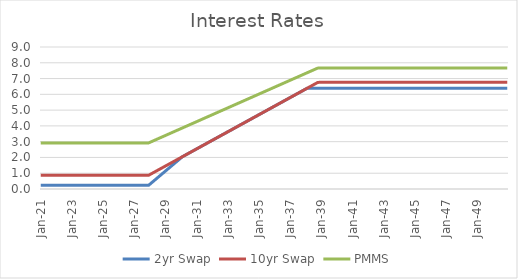
| Category | 2yr Swap | 10yr Swap | PMMS |
|---|---|---|---|
| 2021-01-31 | 0.232 | 0.869 | 2.919 |
| 2021-02-28 | 0.232 | 0.869 | 2.919 |
| 2021-03-31 | 0.232 | 0.869 | 2.919 |
| 2021-04-30 | 0.232 | 0.869 | 2.919 |
| 2021-05-31 | 0.232 | 0.869 | 2.919 |
| 2021-06-30 | 0.232 | 0.869 | 2.919 |
| 2021-07-31 | 0.232 | 0.869 | 2.919 |
| 2021-08-31 | 0.232 | 0.869 | 2.919 |
| 2021-09-30 | 0.232 | 0.869 | 2.919 |
| 2021-10-31 | 0.232 | 0.869 | 2.919 |
| 2021-11-30 | 0.232 | 0.869 | 2.919 |
| 2021-12-31 | 0.232 | 0.869 | 2.919 |
| 2022-01-31 | 0.232 | 0.869 | 2.919 |
| 2022-02-28 | 0.232 | 0.869 | 2.919 |
| 2022-03-31 | 0.232 | 0.869 | 2.919 |
| 2022-04-30 | 0.232 | 0.869 | 2.919 |
| 2022-05-31 | 0.232 | 0.869 | 2.919 |
| 2022-06-30 | 0.232 | 0.869 | 2.919 |
| 2022-07-31 | 0.232 | 0.869 | 2.919 |
| 2022-08-31 | 0.232 | 0.869 | 2.919 |
| 2022-09-30 | 0.232 | 0.869 | 2.919 |
| 2022-10-31 | 0.232 | 0.869 | 2.919 |
| 2022-11-30 | 0.232 | 0.869 | 2.919 |
| 2022-12-31 | 0.232 | 0.869 | 2.919 |
| 2023-01-31 | 0.232 | 0.869 | 2.919 |
| 2023-02-28 | 0.232 | 0.869 | 2.919 |
| 2023-03-31 | 0.232 | 0.869 | 2.919 |
| 2023-04-30 | 0.232 | 0.869 | 2.919 |
| 2023-05-31 | 0.232 | 0.869 | 2.919 |
| 2023-06-30 | 0.232 | 0.869 | 2.919 |
| 2023-07-31 | 0.232 | 0.869 | 2.919 |
| 2023-08-31 | 0.232 | 0.869 | 2.919 |
| 2023-09-30 | 0.232 | 0.869 | 2.919 |
| 2023-10-31 | 0.232 | 0.869 | 2.919 |
| 2023-11-30 | 0.232 | 0.869 | 2.919 |
| 2023-12-31 | 0.232 | 0.869 | 2.919 |
| 2024-01-31 | 0.232 | 0.869 | 2.919 |
| 2024-02-29 | 0.232 | 0.869 | 2.919 |
| 2024-03-31 | 0.232 | 0.869 | 2.919 |
| 2024-04-30 | 0.232 | 0.869 | 2.919 |
| 2024-05-31 | 0.232 | 0.869 | 2.919 |
| 2024-06-30 | 0.232 | 0.869 | 2.919 |
| 2024-07-31 | 0.232 | 0.869 | 2.919 |
| 2024-08-31 | 0.232 | 0.869 | 2.919 |
| 2024-09-30 | 0.232 | 0.869 | 2.919 |
| 2024-10-31 | 0.232 | 0.869 | 2.919 |
| 2024-11-30 | 0.232 | 0.869 | 2.919 |
| 2024-12-31 | 0.232 | 0.869 | 2.919 |
| 2025-01-31 | 0.232 | 0.869 | 2.919 |
| 2025-02-28 | 0.232 | 0.869 | 2.919 |
| 2025-03-31 | 0.232 | 0.869 | 2.919 |
| 2025-04-30 | 0.232 | 0.869 | 2.919 |
| 2025-05-31 | 0.232 | 0.869 | 2.919 |
| 2025-06-30 | 0.232 | 0.869 | 2.919 |
| 2025-07-31 | 0.232 | 0.869 | 2.919 |
| 2025-08-31 | 0.232 | 0.869 | 2.919 |
| 2025-09-30 | 0.232 | 0.869 | 2.919 |
| 2025-10-31 | 0.232 | 0.869 | 2.919 |
| 2025-11-30 | 0.232 | 0.869 | 2.919 |
| 2025-12-31 | 0.232 | 0.869 | 2.919 |
| 2026-01-31 | 0.232 | 0.869 | 2.919 |
| 2026-02-28 | 0.232 | 0.869 | 2.919 |
| 2026-03-31 | 0.232 | 0.869 | 2.919 |
| 2026-04-30 | 0.232 | 0.869 | 2.919 |
| 2026-05-31 | 0.232 | 0.869 | 2.919 |
| 2026-06-30 | 0.232 | 0.869 | 2.919 |
| 2026-07-31 | 0.232 | 0.869 | 2.919 |
| 2026-08-31 | 0.232 | 0.869 | 2.919 |
| 2026-09-30 | 0.232 | 0.869 | 2.919 |
| 2026-10-31 | 0.232 | 0.869 | 2.919 |
| 2026-11-30 | 0.232 | 0.869 | 2.919 |
| 2026-12-31 | 0.232 | 0.869 | 2.919 |
| 2027-01-31 | 0.232 | 0.869 | 2.919 |
| 2027-02-28 | 0.232 | 0.869 | 2.919 |
| 2027-03-31 | 0.232 | 0.869 | 2.919 |
| 2027-04-30 | 0.232 | 0.869 | 2.919 |
| 2027-05-31 | 0.232 | 0.869 | 2.919 |
| 2027-06-30 | 0.232 | 0.869 | 2.919 |
| 2027-07-31 | 0.232 | 0.869 | 2.919 |
| 2027-08-31 | 0.232 | 0.869 | 2.919 |
| 2027-09-30 | 0.232 | 0.869 | 2.919 |
| 2027-10-31 | 0.232 | 0.869 | 2.919 |
| 2027-11-30 | 0.232 | 0.869 | 2.919 |
| 2027-12-31 | 0.232 | 0.869 | 2.919 |
| 2028-01-31 | 0.301 | 0.914 | 2.956 |
| 2028-02-29 | 0.371 | 0.959 | 2.992 |
| 2028-03-31 | 0.441 | 1.004 | 3.028 |
| 2028-04-30 | 0.51 | 1.05 | 3.065 |
| 2028-05-31 | 0.58 | 1.095 | 3.101 |
| 2028-06-30 | 0.65 | 1.14 | 3.138 |
| 2028-07-31 | 0.719 | 1.185 | 3.174 |
| 2028-08-31 | 0.789 | 1.23 | 3.211 |
| 2028-09-30 | 0.859 | 1.276 | 3.247 |
| 2028-10-31 | 0.928 | 1.321 | 3.284 |
| 2028-11-30 | 0.998 | 1.366 | 3.32 |
| 2028-12-31 | 1.068 | 1.411 | 3.357 |
| 2029-01-31 | 1.137 | 1.457 | 3.393 |
| 2029-02-28 | 1.207 | 1.502 | 3.43 |
| 2029-03-31 | 1.277 | 1.547 | 3.466 |
| 2029-04-30 | 1.346 | 1.592 | 3.503 |
| 2029-05-31 | 1.416 | 1.637 | 3.539 |
| 2029-06-30 | 1.486 | 1.683 | 3.576 |
| 2029-07-31 | 1.555 | 1.728 | 3.612 |
| 2029-08-31 | 1.625 | 1.773 | 3.649 |
| 2029-09-30 | 1.695 | 1.818 | 3.685 |
| 2029-10-31 | 1.764 | 1.864 | 3.722 |
| 2029-11-30 | 1.834 | 1.909 | 3.758 |
| 2029-12-31 | 1.904 | 1.954 | 3.795 |
| 2030-01-31 | 1.973 | 1.999 | 3.831 |
| 2030-02-28 | 2.043 | 2.044 | 3.868 |
| 2030-03-31 | 2.09 | 2.09 | 3.904 |
| 2030-04-30 | 2.135 | 2.135 | 3.94 |
| 2030-05-31 | 2.18 | 2.18 | 3.977 |
| 2030-06-30 | 2.225 | 2.225 | 4.013 |
| 2030-07-31 | 2.27 | 2.27 | 4.05 |
| 2030-08-31 | 2.316 | 2.316 | 4.086 |
| 2030-09-30 | 2.361 | 2.361 | 4.123 |
| 2030-10-31 | 2.406 | 2.406 | 4.159 |
| 2030-11-30 | 2.451 | 2.451 | 4.196 |
| 2030-12-31 | 2.497 | 2.497 | 4.232 |
| 2031-01-31 | 2.542 | 2.542 | 4.269 |
| 2031-02-28 | 2.587 | 2.587 | 4.305 |
| 2031-03-31 | 2.632 | 2.632 | 4.342 |
| 2031-04-30 | 2.677 | 2.677 | 4.378 |
| 2031-05-31 | 2.723 | 2.723 | 4.414 |
| 2031-06-30 | 2.768 | 2.768 | 4.451 |
| 2031-07-31 | 2.813 | 2.813 | 4.487 |
| 2031-08-31 | 2.858 | 2.858 | 4.524 |
| 2031-09-30 | 2.904 | 2.904 | 4.56 |
| 2031-10-31 | 2.949 | 2.949 | 4.597 |
| 2031-11-30 | 2.994 | 2.994 | 4.633 |
| 2031-12-31 | 3.039 | 3.039 | 4.67 |
| 2032-01-31 | 3.084 | 3.084 | 4.706 |
| 2032-02-29 | 3.13 | 3.13 | 4.743 |
| 2032-03-31 | 3.175 | 3.175 | 4.779 |
| 2032-04-30 | 3.22 | 3.22 | 4.816 |
| 2032-05-31 | 3.265 | 3.265 | 4.852 |
| 2032-06-30 | 3.311 | 3.311 | 4.888 |
| 2032-07-31 | 3.356 | 3.356 | 4.925 |
| 2032-08-31 | 3.401 | 3.401 | 4.961 |
| 2032-09-30 | 3.446 | 3.446 | 4.998 |
| 2032-10-31 | 3.491 | 3.491 | 5.034 |
| 2032-11-30 | 3.537 | 3.537 | 5.071 |
| 2032-12-31 | 3.582 | 3.582 | 5.107 |
| 2033-01-31 | 3.627 | 3.627 | 5.144 |
| 2033-02-28 | 3.672 | 3.672 | 5.18 |
| 2033-03-31 | 3.718 | 3.718 | 5.217 |
| 2033-04-30 | 3.763 | 3.763 | 5.253 |
| 2033-05-31 | 3.808 | 3.808 | 5.29 |
| 2033-06-30 | 3.853 | 3.853 | 5.326 |
| 2033-07-31 | 3.898 | 3.898 | 5.362 |
| 2033-08-31 | 3.944 | 3.944 | 5.399 |
| 2033-09-30 | 3.989 | 3.989 | 5.435 |
| 2033-10-31 | 4.034 | 4.034 | 5.472 |
| 2033-11-30 | 4.079 | 4.079 | 5.508 |
| 2033-12-31 | 4.125 | 4.125 | 5.545 |
| 2034-01-31 | 4.17 | 4.17 | 5.581 |
| 2034-02-28 | 4.215 | 4.215 | 5.618 |
| 2034-03-31 | 4.26 | 4.26 | 5.654 |
| 2034-04-30 | 4.305 | 4.305 | 5.691 |
| 2034-05-31 | 4.351 | 4.351 | 5.727 |
| 2034-06-30 | 4.396 | 4.396 | 5.764 |
| 2034-07-31 | 4.441 | 4.441 | 5.8 |
| 2034-08-31 | 4.486 | 4.486 | 5.836 |
| 2034-09-30 | 4.532 | 4.532 | 5.873 |
| 2034-10-31 | 4.577 | 4.577 | 5.909 |
| 2034-11-30 | 4.622 | 4.622 | 5.946 |
| 2034-12-31 | 4.667 | 4.667 | 5.982 |
| 2035-01-31 | 4.712 | 4.712 | 6.019 |
| 2035-02-28 | 4.758 | 4.758 | 6.055 |
| 2035-03-31 | 4.803 | 4.803 | 6.092 |
| 2035-04-30 | 4.848 | 4.848 | 6.128 |
| 2035-05-31 | 4.893 | 4.893 | 6.165 |
| 2035-06-30 | 4.939 | 4.939 | 6.201 |
| 2035-07-31 | 4.984 | 4.984 | 6.238 |
| 2035-08-31 | 5.029 | 5.029 | 6.274 |
| 2035-09-30 | 5.074 | 5.074 | 6.31 |
| 2035-10-31 | 5.119 | 5.119 | 6.347 |
| 2035-11-30 | 5.165 | 5.165 | 6.383 |
| 2035-12-31 | 5.21 | 5.21 | 6.42 |
| 2036-01-31 | 5.255 | 5.255 | 6.456 |
| 2036-02-29 | 5.3 | 5.3 | 6.493 |
| 2036-03-31 | 5.345 | 5.345 | 6.529 |
| 2036-04-30 | 5.391 | 5.391 | 6.566 |
| 2036-05-31 | 5.436 | 5.436 | 6.602 |
| 2036-06-30 | 5.481 | 5.481 | 6.639 |
| 2036-07-31 | 5.526 | 5.526 | 6.675 |
| 2036-08-31 | 5.572 | 5.572 | 6.712 |
| 2036-09-30 | 5.617 | 5.617 | 6.748 |
| 2036-10-31 | 5.662 | 5.662 | 6.784 |
| 2036-11-30 | 5.707 | 5.707 | 6.821 |
| 2036-12-31 | 5.752 | 5.752 | 6.857 |
| 2037-01-31 | 5.798 | 5.798 | 6.894 |
| 2037-02-28 | 5.843 | 5.843 | 6.93 |
| 2037-03-31 | 5.888 | 5.888 | 6.967 |
| 2037-04-30 | 5.933 | 5.933 | 7.003 |
| 2037-05-31 | 5.979 | 5.979 | 7.04 |
| 2037-06-30 | 6.024 | 6.024 | 7.076 |
| 2037-07-31 | 6.069 | 6.069 | 7.113 |
| 2037-08-31 | 6.114 | 6.114 | 7.149 |
| 2037-09-30 | 6.159 | 6.159 | 7.186 |
| 2037-10-31 | 6.205 | 6.205 | 7.222 |
| 2037-11-30 | 6.25 | 6.25 | 7.258 |
| 2037-12-31 | 6.295 | 6.295 | 7.295 |
| 2038-01-31 | 6.34 | 6.34 | 7.331 |
| 2038-02-28 | 6.386 | 6.386 | 7.368 |
| 2038-03-31 | 6.387 | 6.431 | 7.404 |
| 2038-04-30 | 6.387 | 6.476 | 7.441 |
| 2038-05-31 | 6.387 | 6.521 | 7.477 |
| 2038-06-30 | 6.387 | 6.566 | 7.514 |
| 2038-07-31 | 6.387 | 6.612 | 7.55 |
| 2038-08-31 | 6.387 | 6.657 | 7.586 |
| 2038-09-30 | 6.387 | 6.702 | 7.623 |
| 2038-10-31 | 6.387 | 6.747 | 7.659 |
| 2038-11-30 | 6.387 | 6.758 | 7.668 |
| 2038-12-31 | 6.387 | 6.758 | 7.668 |
| 2039-01-31 | 6.387 | 6.758 | 7.668 |
| 2039-02-28 | 6.387 | 6.758 | 7.668 |
| 2039-03-31 | 6.387 | 6.758 | 7.668 |
| 2039-04-30 | 6.387 | 6.758 | 7.668 |
| 2039-05-31 | 6.387 | 6.758 | 7.668 |
| 2039-06-30 | 6.387 | 6.758 | 7.668 |
| 2039-07-31 | 6.387 | 6.758 | 7.668 |
| 2039-08-31 | 6.387 | 6.758 | 7.668 |
| 2039-09-30 | 6.387 | 6.758 | 7.668 |
| 2039-10-31 | 6.387 | 6.758 | 7.668 |
| 2039-11-30 | 6.387 | 6.758 | 7.668 |
| 2039-12-31 | 6.387 | 6.758 | 7.668 |
| 2040-01-31 | 6.387 | 6.758 | 7.668 |
| 2040-02-29 | 6.387 | 6.758 | 7.668 |
| 2040-03-31 | 6.387 | 6.758 | 7.668 |
| 2040-04-30 | 6.387 | 6.758 | 7.668 |
| 2040-05-31 | 6.387 | 6.758 | 7.668 |
| 2040-06-30 | 6.387 | 6.758 | 7.668 |
| 2040-07-31 | 6.387 | 6.758 | 7.668 |
| 2040-08-31 | 6.387 | 6.758 | 7.668 |
| 2040-09-30 | 6.387 | 6.758 | 7.668 |
| 2040-10-31 | 6.387 | 6.758 | 7.668 |
| 2040-11-30 | 6.387 | 6.758 | 7.668 |
| 2040-12-31 | 6.387 | 6.758 | 7.668 |
| 2041-01-31 | 6.387 | 6.758 | 7.668 |
| 2041-02-28 | 6.387 | 6.758 | 7.668 |
| 2041-03-31 | 6.387 | 6.758 | 7.668 |
| 2041-04-30 | 6.387 | 6.758 | 7.668 |
| 2041-05-31 | 6.387 | 6.758 | 7.668 |
| 2041-06-30 | 6.387 | 6.758 | 7.668 |
| 2041-07-31 | 6.387 | 6.758 | 7.668 |
| 2041-08-31 | 6.387 | 6.758 | 7.668 |
| 2041-09-30 | 6.387 | 6.758 | 7.668 |
| 2041-10-31 | 6.387 | 6.758 | 7.668 |
| 2041-11-30 | 6.387 | 6.758 | 7.668 |
| 2041-12-31 | 6.387 | 6.758 | 7.668 |
| 2042-01-31 | 6.387 | 6.758 | 7.668 |
| 2042-02-28 | 6.387 | 6.758 | 7.668 |
| 2042-03-31 | 6.387 | 6.758 | 7.668 |
| 2042-04-30 | 6.387 | 6.758 | 7.668 |
| 2042-05-31 | 6.387 | 6.758 | 7.668 |
| 2042-06-30 | 6.387 | 6.758 | 7.668 |
| 2042-07-31 | 6.387 | 6.758 | 7.668 |
| 2042-08-31 | 6.387 | 6.758 | 7.668 |
| 2042-09-30 | 6.387 | 6.758 | 7.668 |
| 2042-10-31 | 6.387 | 6.758 | 7.668 |
| 2042-11-30 | 6.387 | 6.758 | 7.668 |
| 2042-12-31 | 6.387 | 6.758 | 7.668 |
| 2043-01-31 | 6.387 | 6.758 | 7.668 |
| 2043-02-28 | 6.387 | 6.758 | 7.668 |
| 2043-03-31 | 6.387 | 6.758 | 7.668 |
| 2043-04-30 | 6.387 | 6.758 | 7.668 |
| 2043-05-31 | 6.387 | 6.758 | 7.668 |
| 2043-06-30 | 6.387 | 6.758 | 7.668 |
| 2043-07-31 | 6.387 | 6.758 | 7.668 |
| 2043-08-31 | 6.387 | 6.758 | 7.668 |
| 2043-09-30 | 6.387 | 6.758 | 7.668 |
| 2043-10-31 | 6.387 | 6.758 | 7.668 |
| 2043-11-30 | 6.387 | 6.758 | 7.668 |
| 2043-12-31 | 6.387 | 6.758 | 7.668 |
| 2044-01-31 | 6.387 | 6.758 | 7.668 |
| 2044-02-29 | 6.387 | 6.758 | 7.668 |
| 2044-03-31 | 6.387 | 6.758 | 7.668 |
| 2044-04-30 | 6.387 | 6.758 | 7.668 |
| 2044-05-31 | 6.387 | 6.758 | 7.668 |
| 2044-06-30 | 6.387 | 6.758 | 7.668 |
| 2044-07-31 | 6.387 | 6.758 | 7.668 |
| 2044-08-31 | 6.387 | 6.758 | 7.668 |
| 2044-09-30 | 6.387 | 6.758 | 7.668 |
| 2044-10-31 | 6.387 | 6.758 | 7.668 |
| 2044-11-30 | 6.387 | 6.758 | 7.668 |
| 2044-12-31 | 6.387 | 6.758 | 7.668 |
| 2045-01-31 | 6.387 | 6.758 | 7.668 |
| 2045-02-28 | 6.387 | 6.758 | 7.668 |
| 2045-03-31 | 6.387 | 6.758 | 7.668 |
| 2045-04-30 | 6.387 | 6.758 | 7.668 |
| 2045-05-31 | 6.387 | 6.758 | 7.668 |
| 2045-06-30 | 6.387 | 6.758 | 7.668 |
| 2045-07-31 | 6.387 | 6.758 | 7.668 |
| 2045-08-31 | 6.387 | 6.758 | 7.668 |
| 2045-09-30 | 6.387 | 6.758 | 7.668 |
| 2045-10-31 | 6.387 | 6.758 | 7.668 |
| 2045-11-30 | 6.387 | 6.758 | 7.668 |
| 2045-12-31 | 6.387 | 6.758 | 7.668 |
| 2046-01-31 | 6.387 | 6.758 | 7.668 |
| 2046-02-28 | 6.387 | 6.758 | 7.668 |
| 2046-03-31 | 6.387 | 6.758 | 7.668 |
| 2046-04-30 | 6.387 | 6.758 | 7.668 |
| 2046-05-31 | 6.387 | 6.758 | 7.668 |
| 2046-06-30 | 6.387 | 6.758 | 7.668 |
| 2046-07-31 | 6.387 | 6.758 | 7.668 |
| 2046-08-31 | 6.387 | 6.758 | 7.668 |
| 2046-09-30 | 6.387 | 6.758 | 7.668 |
| 2046-10-31 | 6.387 | 6.758 | 7.668 |
| 2046-11-30 | 6.387 | 6.758 | 7.668 |
| 2046-12-31 | 6.387 | 6.758 | 7.668 |
| 2047-01-31 | 6.387 | 6.758 | 7.668 |
| 2047-02-28 | 6.387 | 6.758 | 7.668 |
| 2047-03-31 | 6.387 | 6.758 | 7.668 |
| 2047-04-30 | 6.387 | 6.758 | 7.668 |
| 2047-05-31 | 6.387 | 6.758 | 7.668 |
| 2047-06-30 | 6.387 | 6.758 | 7.668 |
| 2047-07-31 | 6.387 | 6.758 | 7.668 |
| 2047-08-31 | 6.387 | 6.758 | 7.668 |
| 2047-09-30 | 6.387 | 6.758 | 7.668 |
| 2047-10-31 | 6.387 | 6.758 | 7.668 |
| 2047-11-30 | 6.387 | 6.758 | 7.668 |
| 2047-12-31 | 6.387 | 6.758 | 7.668 |
| 2048-01-31 | 6.387 | 6.758 | 7.668 |
| 2048-02-29 | 6.387 | 6.758 | 7.668 |
| 2048-03-31 | 6.387 | 6.758 | 7.668 |
| 2048-04-30 | 6.387 | 6.758 | 7.668 |
| 2048-05-31 | 6.387 | 6.758 | 7.668 |
| 2048-06-30 | 6.387 | 6.758 | 7.668 |
| 2048-07-31 | 6.387 | 6.758 | 7.668 |
| 2048-08-31 | 6.387 | 6.758 | 7.668 |
| 2048-09-30 | 6.387 | 6.758 | 7.668 |
| 2048-10-31 | 6.387 | 6.758 | 7.668 |
| 2048-11-30 | 6.387 | 6.758 | 7.668 |
| 2048-12-31 | 6.387 | 6.758 | 7.668 |
| 2049-01-31 | 6.387 | 6.758 | 7.668 |
| 2049-02-28 | 6.387 | 6.758 | 7.668 |
| 2049-03-31 | 6.387 | 6.758 | 7.668 |
| 2049-04-30 | 6.387 | 6.758 | 7.668 |
| 2049-05-31 | 6.387 | 6.758 | 7.668 |
| 2049-06-30 | 6.387 | 6.758 | 7.668 |
| 2049-07-31 | 6.387 | 6.758 | 7.668 |
| 2049-08-31 | 6.387 | 6.758 | 7.668 |
| 2049-09-30 | 6.387 | 6.758 | 7.668 |
| 2049-10-31 | 6.387 | 6.758 | 7.668 |
| 2049-11-30 | 6.387 | 6.758 | 7.668 |
| 2049-12-31 | 6.387 | 6.758 | 7.668 |
| 2050-01-31 | 6.387 | 6.758 | 7.668 |
| 2050-02-28 | 6.387 | 6.758 | 7.668 |
| 2050-03-31 | 6.387 | 6.758 | 7.668 |
| 2050-04-30 | 6.387 | 6.758 | 7.668 |
| 2050-05-31 | 6.387 | 6.758 | 7.668 |
| 2050-06-30 | 6.387 | 6.758 | 7.668 |
| 2050-07-31 | 6.387 | 6.758 | 7.668 |
| 2050-08-31 | 6.387 | 6.758 | 7.668 |
| 2050-09-30 | 6.387 | 6.758 | 7.668 |
| 2050-10-31 | 6.387 | 6.758 | 7.668 |
| 2050-11-30 | 6.387 | 6.758 | 7.668 |
| 2050-12-31 | 6.387 | 6.758 | 7.668 |